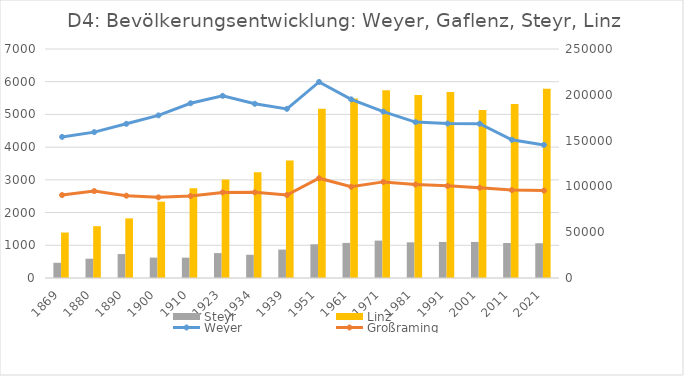
| Category | Steyr  | Linz |
|---|---|---|
| 1869.0 | 16593 | 49635 |
| 1880.0 | 21054 | 56569 |
| 1890.0 | 26139 | 65090 |
| 1900.0 | 22272 | 83356 |
| 1910.0 | 22205 | 97852 |
| 1923.0 | 27200 | 107463 |
| 1934.0 | 25351 | 115338 |
| 1939.0 | 31017 | 128177 |
| 1951.0 | 36818 | 184685 |
| 1961.0 | 38306 | 195978 |
| 1971.0 | 40822 | 204889 |
| 1981.0 | 38942 | 199910 |
| 1991.0 | 39337 | 203044 |
| 2001.0 | 39340 | 183504 |
| 2011.0 | 38205 | 189889 |
| 2021.0 | 37952 | 206537 |